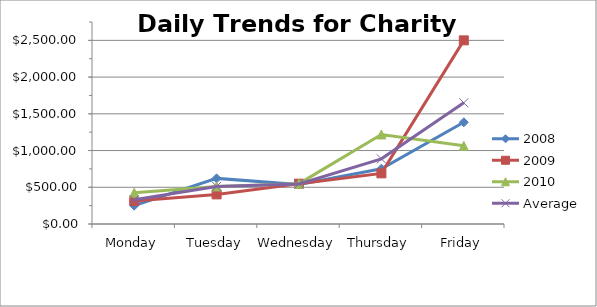
| Category | 2008 | 2009 | 2010 | Average |
|---|---|---|---|---|
| Monday | 249.53 | 314.11 | 426.9 | 330.18 |
| Tuesday | 621.04 | 402.93 | 511.53 | 511.833 |
| Wednesday | 537.8 | 549.21 | 549.46 | 545.49 |
| Thursday | 752.87 | 689.32 | 1218.85 | 887.013 |
| Friday | 1384.73 | 2499.93 | 1064.32 | 1649.66 |